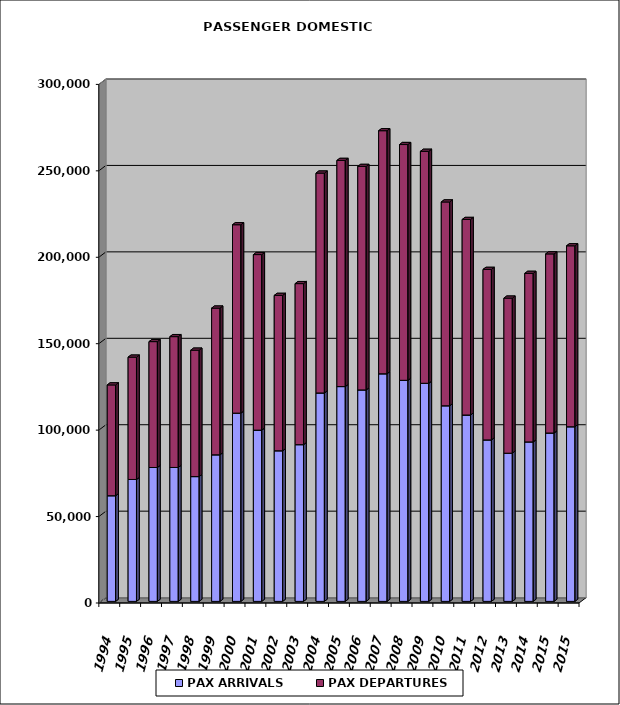
| Category | PAX ARRIVALS | PAX DEPARTURES |
|---|---|---|
| 1994.0 | 61128 | 64087 |
| 1995.0 | 70528 | 70755 |
| 1996.0 | 77442 | 72829 |
| 1997.0 | 77465 | 75686 |
| 1998.0 | 72191 | 73121 |
| 1999.0 | 84803 | 84847 |
| 2000.0 | 108894 | 108982 |
| 2001.0 | 99072 | 101542 |
| 2002.0 | 87132 | 89871 |
| 2003.0 | 90670 | 93151 |
| 2004.0 | 120578 | 127180 |
| 2005.0 | 124263 | 130814 |
| 2006.0 | 122334 | 129276 |
| 2007.0 | 131670 | 140601 |
| 2008.0 | 127889 | 136387 |
| 2009.0 | 126171 | 134176 |
| 2010.0 | 113168 | 117889 |
| 2011.0 | 107819 | 113102 |
| 2012.0 | 93412 | 98631 |
| 2013.0 | 85723 | 89699 |
| 2014.0 | 92265 | 97485 |
| 2015.0 | 97411 | 103589 |
| 2015.0 | 101025 | 104670 |